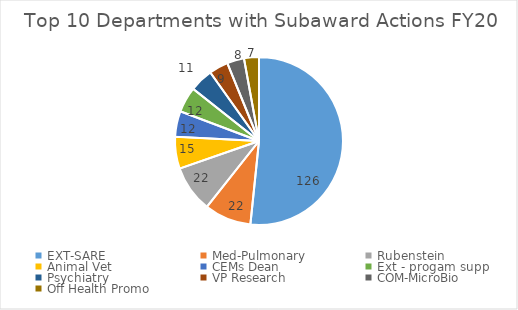
| Category | FY20 |
|---|---|
| EXT-SARE | 126 |
| Med-Pulmonary | 22 |
| Rubenstein | 22 |
| Animal Vet | 15 |
| CEMs Dean | 12 |
| Ext - progam supp | 12 |
| Psychiatry | 11 |
| VP Research | 9 |
| COM-MicroBio | 8 |
| Off Health Promo | 7 |